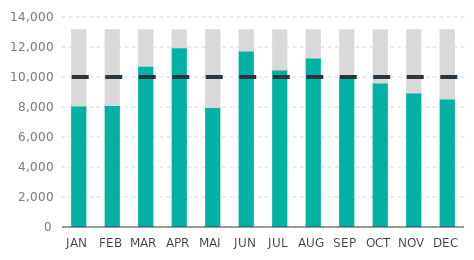
| Category | Actual | Max |
|---|---|---|
| JAN | 8104 | 5072.9 |
| FEB | 8141 | 5035.9 |
| MAR | 10748 | 2428.9 |
| APR | 11979 | 1197.9 |
| MAI | 8003 | 5173.9 |
| JUN | 11765 | 1411.9 |
| JUL | 10500 | 2676.9 |
| AUG | 11295 | 1881.9 |
| SEP | 9952 | 3224.9 |
| OCT | 9626 | 3550.9 |
| NOV | 8964 | 4212.9 |
| DEC | 8563 | 4613.9 |